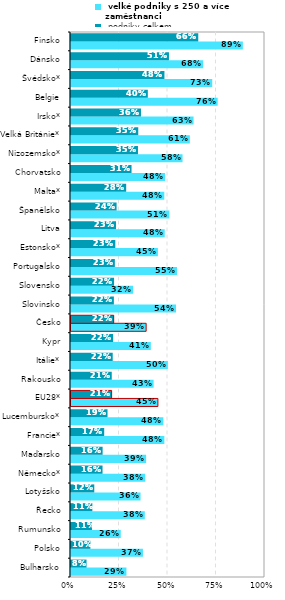
| Category |  velké podniky s 250 a více zaměstnanci |  podniky celkem |
|---|---|---|
| Bulharsko | 0.286 | 0.08 |
| Polsko | 0.371 | 0.1 |
| Rumunsko | 0.257 | 0.108 |
| Řecko | 0.38 | 0.11 |
| Lotyšsko | 0.358 | 0.12 |
| Německo* | 0.382 | 0.163 |
| Maďarsko | 0.387 | 0.163 |
| Francie* | 0.481 | 0.171 |
| Lucembursko* | 0.476 | 0.188 |
| EU28* | 0.448 | 0.209 |
| Rakousko | 0.426 | 0.21 |
| Itálie* | 0.499 | 0.215 |
| Kypr | 0.411 | 0.217 |
| Česko | 0.387 | 0.22 |
| Slovinsko | 0.541 | 0.221 |
| Slovensko | 0.32 | 0.222 |
| Portugalsko | 0.546 | 0.226 |
| Estonsko* | 0.448 | 0.228 |
| Litva | 0.483 | 0.232 |
| Španělsko | 0.507 | 0.235 |
| Malta* | 0.481 | 0.284 |
| Chorvatsko | 0.485 | 0.312 |
| Nizozemsko* | 0.575 | 0.345 |
| Velká Británie* | 0.613 | 0.347 |
| Irsko* | 0.632 | 0.361 |
| Belgie | 0.756 | 0.396 |
| Švédsko* | 0.728 | 0.482 |
| Dánsko | 0.681 | 0.505 |
| Finsko | 0.886 | 0.656 |